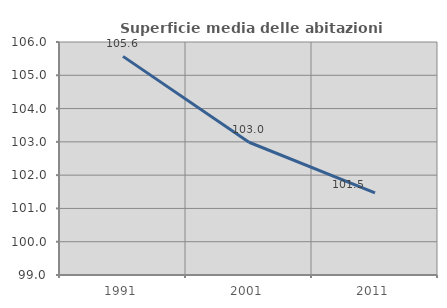
| Category | Superficie media delle abitazioni occupate |
|---|---|
| 1991.0 | 105.568 |
| 2001.0 | 102.988 |
| 2011.0 | 101.464 |